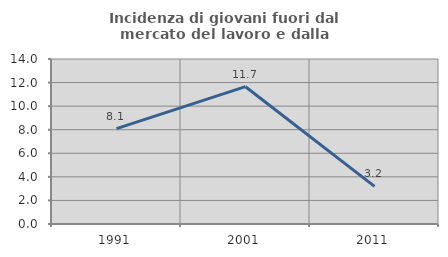
| Category | Incidenza di giovani fuori dal mercato del lavoro e dalla formazione  |
|---|---|
| 1991.0 | 8.088 |
| 2001.0 | 11.65 |
| 2011.0 | 3.191 |